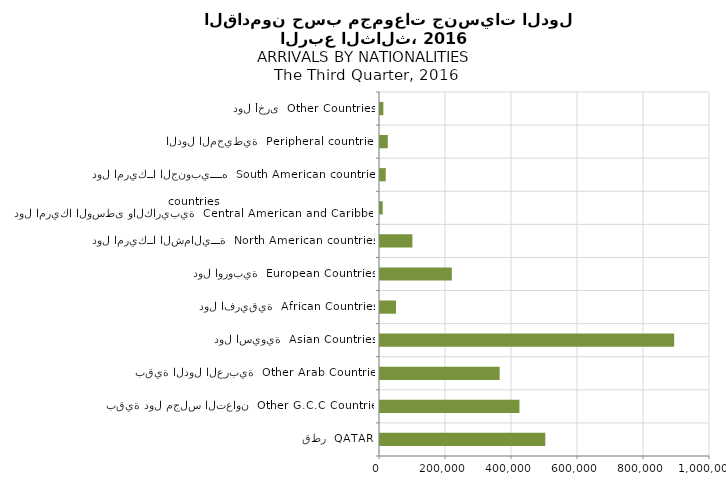
| Category | Series 0 |
|---|---|
| قطر  QATAR | 500872 |
| بقية دول مجلس التعاون  Other G.C.C Countries | 422544 |
| بقية الدول العربية  Other Arab Countries | 362599 |
| دول اسيوية  Asian Countries | 891452 |
| دول افريقية  African Countries | 48539 |
| دول اوروبية  European Countries | 217649 |
| دول امريكــا الشماليـــة  North American countries  | 98171 |
| دول امريكا الوسطى والكاريبية  Central American and Caribbean countries | 8163 |
| دول امريكــا الجنوبيــــه  South American countries | 17310 |
| الدول المحيطية  Peripheral countries | 23560 |
| دول أخرى  Other Countries | 10132 |